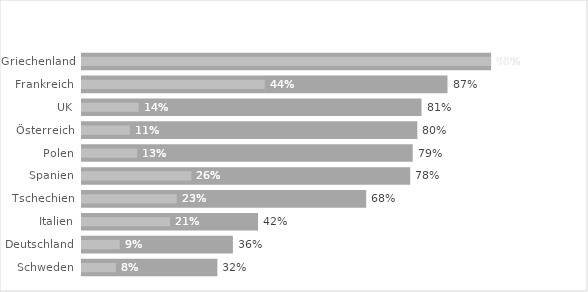
| Category | Marktanteil |
|---|---|
| Schweden | 0.323 |
| Deutschland | 0.36 |
| Italien | 0.42 |
| Tschechien | 0.678 |
| Spanien | 0.783 |
| Polen | 0.789 |
| Österreich | 0.8 |
| UK | 0.81 |
| Frankreich | 0.872 |
| Griechenland | 0.976 |